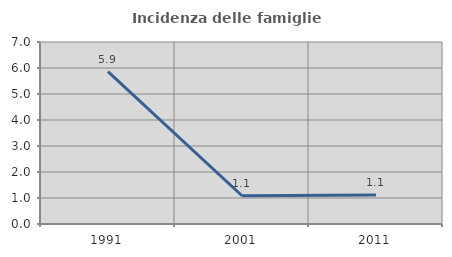
| Category | Incidenza delle famiglie numerose |
|---|---|
| 1991.0 | 5.858 |
| 2001.0 | 1.087 |
| 2011.0 | 1.111 |